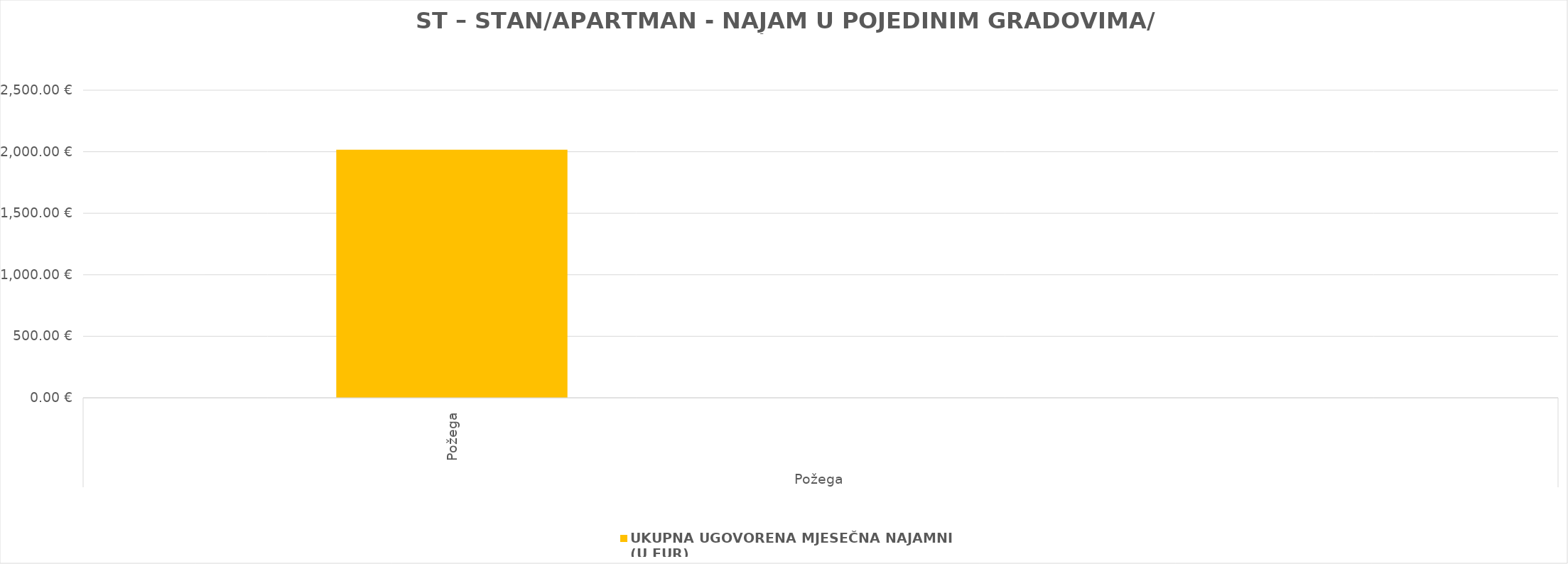
| Category | UKUPNA UGOVORENA MJESEČNA NAJAMNINA 
(U EUR) |
|---|---|
| 0 | 2016.46 |
| 1 | 0 |